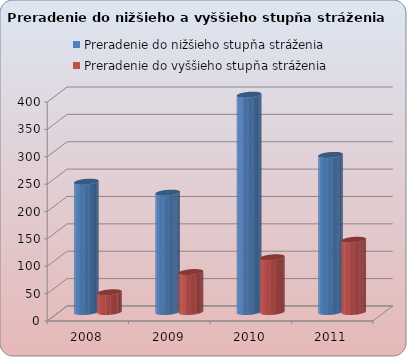
| Category | Preradenie do nižšieho stupňa stráženia | Preradenie do vyššieho stupňa stráženia |
|---|---|---|
| 2008.0 | 238 | 36 |
| 2009.0 | 218 | 73 |
| 2010.0 | 397 | 100 |
| 2011.0 | 287 | 132 |